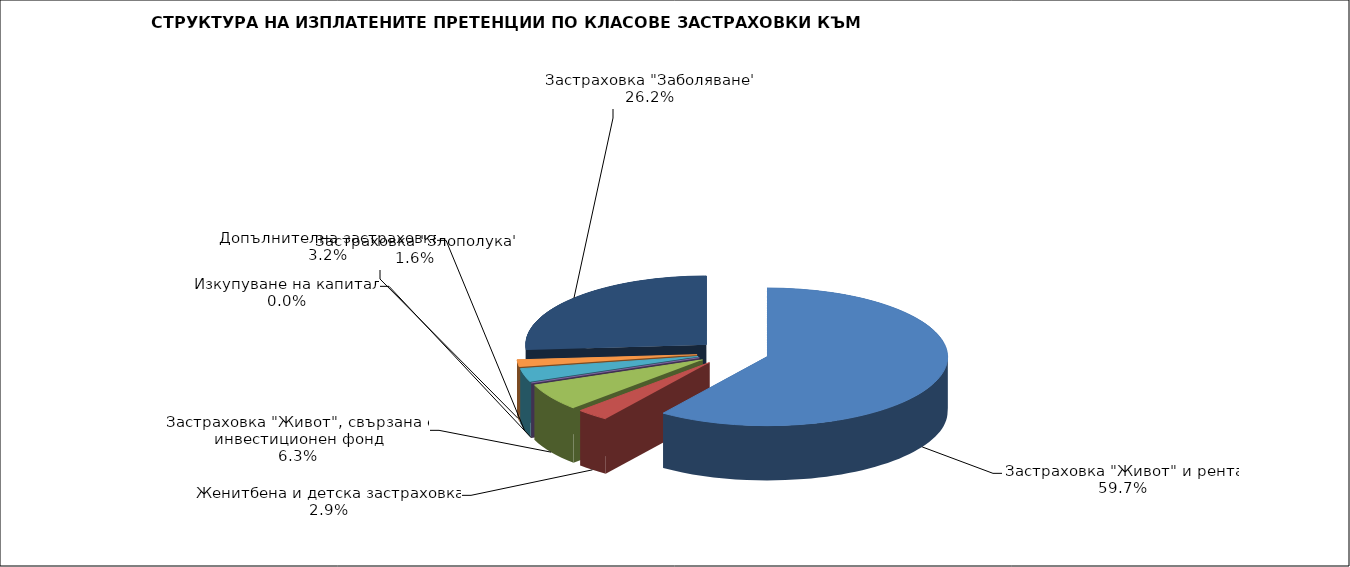
| Category | 58 637 317 |
|---|---|
| Застраховка "Живот" и рента | 58637317.206 |
| Женитбена и детска застраховка | 2882402.67 |
| Застраховка "Живот", свързана с инвестиционен фонд | 6213885.962 |
| Изкупуване на капитал | 0 |
| Допълнителна застраховка | 3095284.9 |
| Застраховка "Злополука" | 1610027.485 |
| Застраховка "Заболяване" | 25713502.466 |